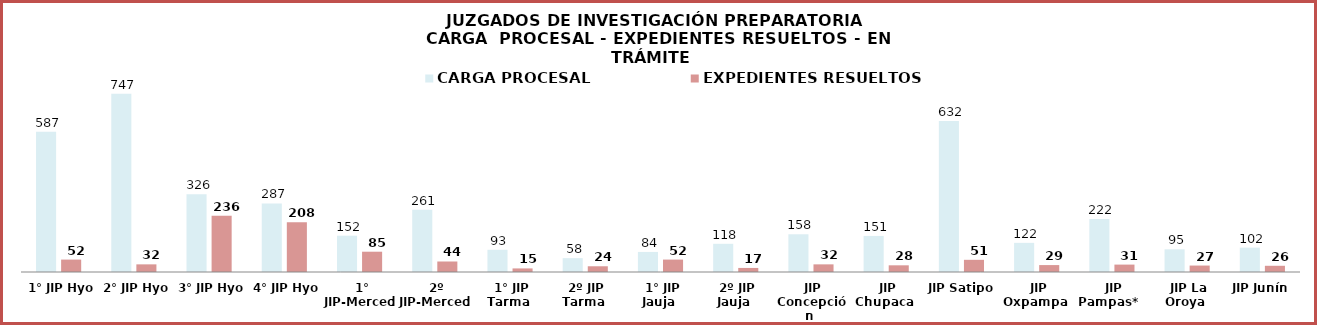
| Category | CARGA PROCESAL | EXPEDIENTES RESUELTOS |
|---|---|---|
| 1° JIP Hyo | 587 | 52 |
| 2° JIP Hyo | 747 | 32 |
| 3° JIP Hyo | 326 | 236 |
| 4° JIP Hyo | 287 | 208 |
| 1° JIP-Merced | 152 | 85 |
| 2º JIP-Merced | 261 | 44 |
| 1° JIP Tarma | 93 | 15 |
| 2º JIP Tarma | 58 | 24 |
| 1° JIP Jauja | 84 | 52 |
| 2º JIP Jauja | 118 | 17 |
| JIP Concepción | 158 | 32 |
| JIP Chupaca | 151 | 28 |
| JIP Satipo | 632 | 51 |
| JIP Oxpampa | 122 | 29 |
| JIP Pampas*  | 222 | 31 |
| JIP La Oroya | 95 | 27 |
| JIP Junín | 102 | 26 |